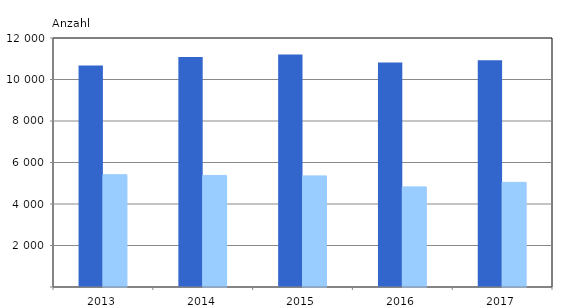
| Category | 18 Jahre bis unter Altersgrenze | Altersgrenze und älter |
|---|---|---|
| 2013.0 | 10676 | 5410 |
| 2014.0 | 11088 | 5377 |
| 2015.0 | 11208 | 5354 |
| 2016.0 | 10818 | 4825 |
| 2017.0 | 10927 | 5043 |